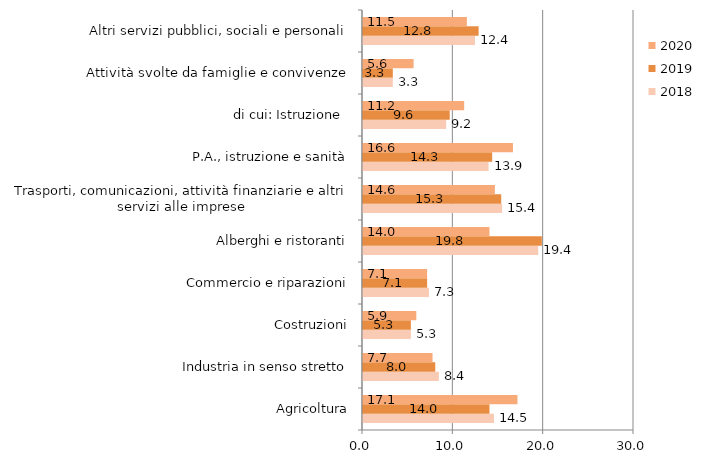
| Category | 2018 | 2019 | 2020 |
|---|---|---|---|
| Agricoltura | 14.5 | 14 | 17.1 |
| Industria in senso stretto | 8.4 | 8 | 7.7 |
| Costruzioni | 5.3 | 5.3 | 5.9 |
| Commercio e riparazioni | 7.3 | 7.1 | 7.1 |
| Alberghi e ristoranti | 19.4 | 19.8 | 14 |
| Trasporti, comunicazioni, attività finanziarie e altri servizi alle imprese | 15.4 | 15.3 | 14.6 |
| P.A., istruzione e sanità | 13.9 | 14.3 | 16.6 |
|         di cui: Istruzione  | 9.2 | 9.6 | 11.2 |
| Attività svolte da famiglie e convivenze | 3.3 | 3.3 | 5.6 |
| Altri servizi pubblici, sociali e personali | 12.4 | 12.8 | 11.5 |